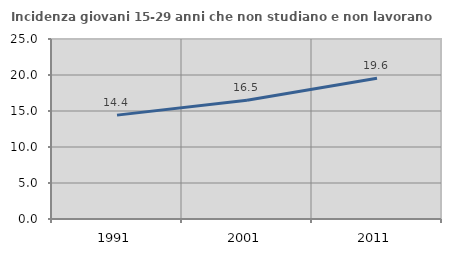
| Category | Incidenza giovani 15-29 anni che non studiano e non lavorano  |
|---|---|
| 1991.0 | 14.428 |
| 2001.0 | 16.489 |
| 2011.0 | 19.551 |